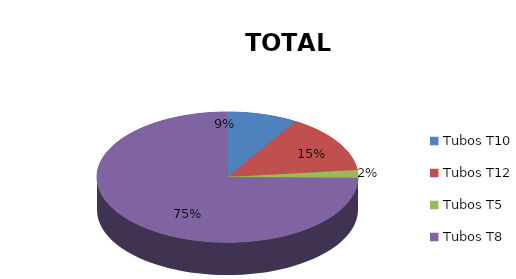
| Category | Series 0 |
|---|---|
| Tubos T10 | 17036 |
| Tubos T12 | 28456 |
| Tubos T5 | 3659 |
| Tubos T8 | 146253 |